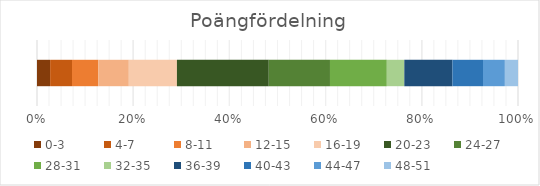
| Category | 0-3 | 4-7 | 8-11 | 12-15 | 16-19 | 20-23 | 24-27 | 28-31 | 32-35 | 36-39 | 40-43 | 44-47 | 48-51 |
|---|---|---|---|---|---|---|---|---|---|---|---|---|---|
| Antal
studenter | 3 | 5 | 6 | 7 | 11 | 21 | 14 | 13 | 4 | 11 | 7 | 5 | 3 |